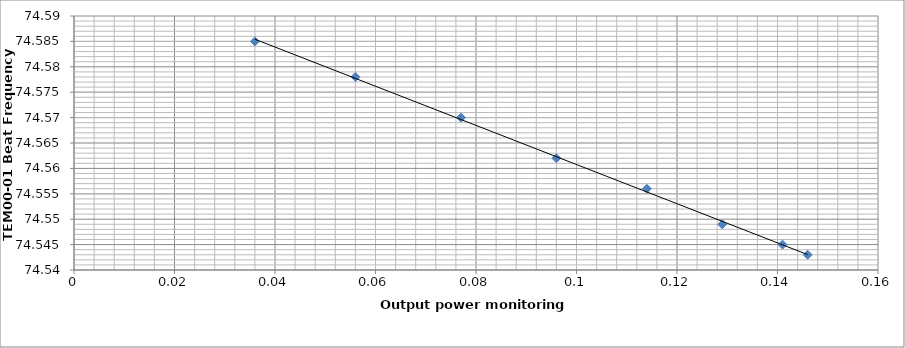
| Category | Series 0 |
|---|---|
| 0.146 | 74.543 |
| 0.141 | 74.545 |
| 0.129 | 74.549 |
| 0.114 | 74.556 |
| 0.096 | 74.562 |
| 0.077 | 74.57 |
| 0.056 | 74.578 |
| 0.036 | 74.585 |